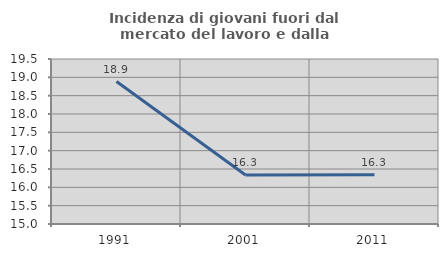
| Category | Incidenza di giovani fuori dal mercato del lavoro e dalla formazione  |
|---|---|
| 1991.0 | 18.885 |
| 2001.0 | 16.337 |
| 2011.0 | 16.346 |